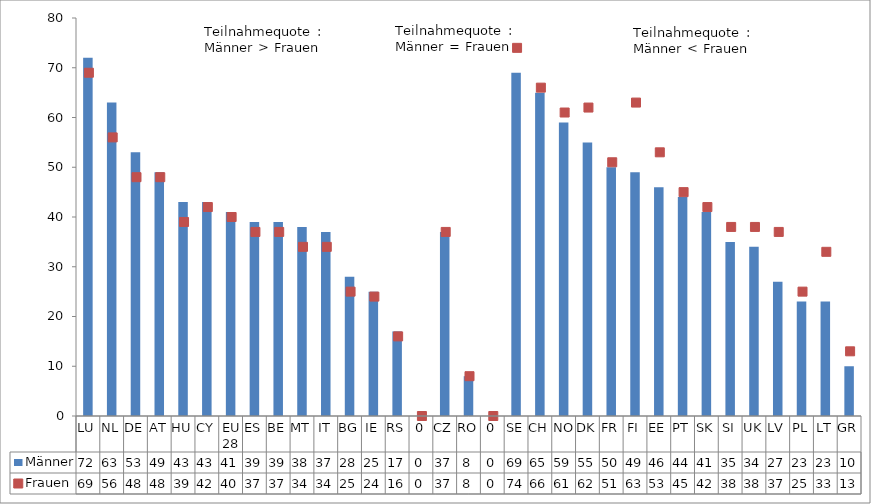
| Category | Männer |
|---|---|
| LU | 72 |
| NL | 63 |
| DE | 53 |
| AT | 49 |
| HU | 43 |
| CY | 43 |
| EU 28 | 41 |
| ES | 39 |
| BE | 39 |
| MT | 38 |
| IT | 37 |
| BG | 28 |
| IE | 25 |
| RS | 17 |
| 0 | 0 |
| CZ | 37 |
| RO | 8 |
| 0 | 0 |
| SE | 69 |
| CH | 65 |
| NO | 59 |
| DK | 55 |
| FR | 50 |
| FI | 49 |
| EE | 46 |
| PT | 44 |
| SK | 41 |
| SI | 35 |
| UK | 34 |
| LV | 27 |
| PL | 23 |
| LT | 23 |
| GR | 10 |